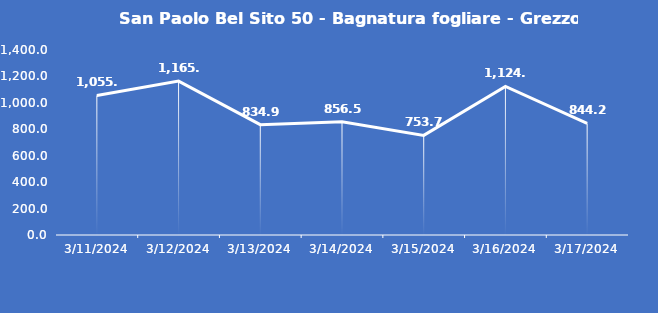
| Category | San Paolo Bel Sito 50 - Bagnatura fogliare - Grezzo (min) |
|---|---|
| 3/11/24 | 1055.9 |
| 3/12/24 | 1165 |
| 3/13/24 | 834.9 |
| 3/14/24 | 856.5 |
| 3/15/24 | 753.7 |
| 3/16/24 | 1124.3 |
| 3/17/24 | 844.2 |